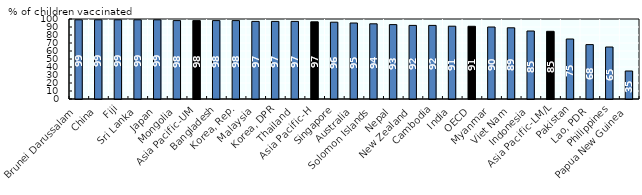
| Category | Series 0 |
|---|---|
| Brunei Darussalam | 99 |
| China | 99 |
| Fiji | 99 |
| Sri Lanka | 99 |
| Japan | 99 |
| Mongolia | 98 |
| Asia Pacific-UM | 98 |
| Bangladesh | 98 |
| Korea, Rep. | 98 |
| Malaysia | 97 |
| Korea, DPR | 97 |
| Thailand | 97 |
| Asia Pacific-H | 96.5 |
| Singapore | 96 |
| Australia | 95 |
| Solomon Islands | 94 |
| Nepal | 93 |
| New Zealand | 92 |
| Cambodia | 92 |
| India | 91 |
| OECD | 90.897 |
| Myanmar | 90 |
| Viet Nam | 89 |
| Indonesia | 85 |
| Asia Pacific-LM/L | 84.6 |
| Pakistan | 75 |
| Lao, PDR | 68 |
| Philippines | 65 |
| Papua New Guinea | 35 |